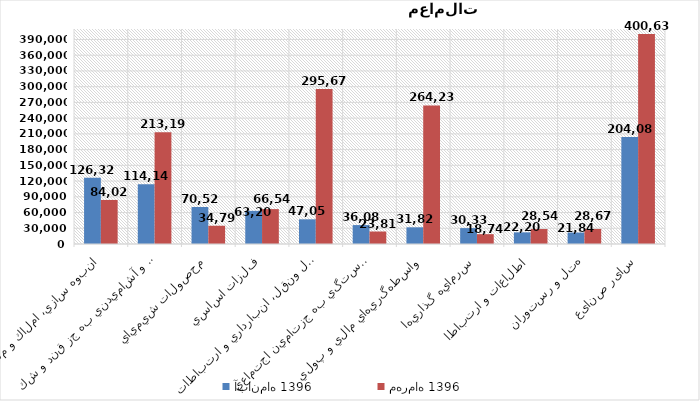
| Category | آبان‌ماه 1396 | مهرماه 1396 |
|---|---|---|
| انبوه سازي، املاك و مستغلات | 126324 | 84028 |
| محصولات غذايي و آشاميدني به جز قند و شكر | 114141 | 213198 |
| محصولات شيميايي | 70522 | 34795 |
| فلزات اساسي | 63201 | 66541 |
| حمل ونقل، انبارداري و ارتباطات | 47054 | 295676 |
| بيمه وصندوق بازنشستگي به جزتامين اجتماعي | 36087 | 23817 |
| واسطه‌گري‌هاي مالي و پولي | 31827 | 264231 |
| سرمايه گذاريها | 30333 | 18743 |
| اطلاعات و ارتباطات | 22206 | 28549 |
| هتل و رستوران | 21849 | 28676 |
| سایر صنایع | 204081 | 400638 |